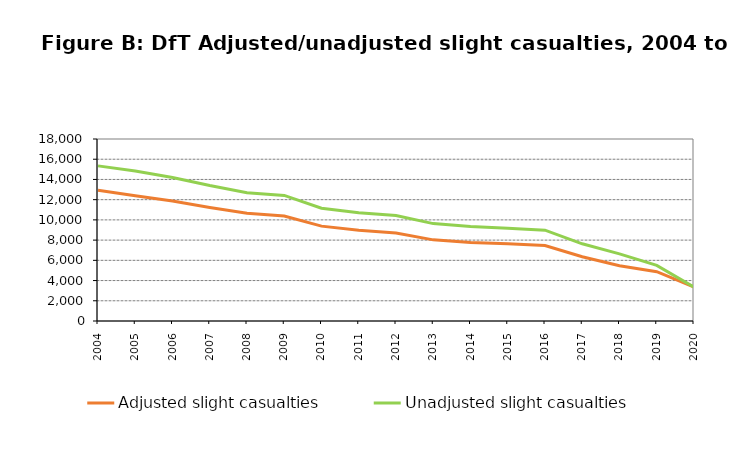
| Category | Adjusted slight casualties | Unadjusted slight casualties |
|---|---|---|
| 0 | 12928 | 15342 |
| 1 | 12383 | 14831 |
| 2 | 11871 | 14199 |
| 3 | 11226 | 13393 |
| 4 | 10655 | 12691 |
| 5 | 10389 | 12424 |
| 6 | 9382 | 11152 |
| 7 | 8985 | 10699 |
| 8 | 8704 | 10442 |
| 9 | 8024 | 9631 |
| 10 | 7770 | 9339 |
| 11 | 7628 | 9176 |
| 12 | 7465 | 8980 |
| 13 | 6352 | 7633 |
| 14 | 5465 | 6635 |
| 15 | 4877 | 5505 |
| 16 | 3352 | 3352 |